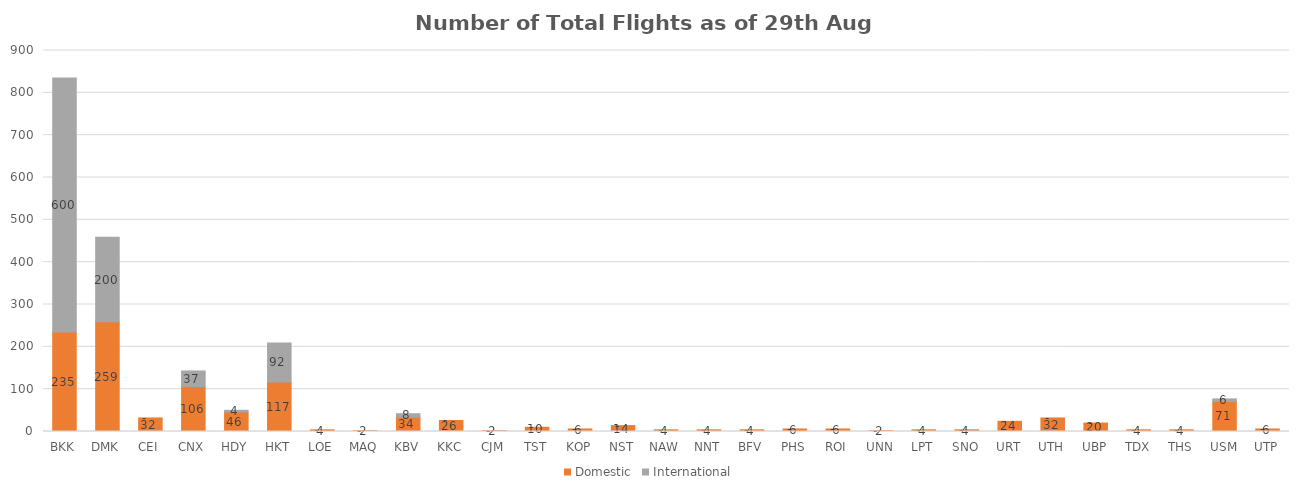
| Category | Domestic | International |
|---|---|---|
| BKK | 235 | 600 |
| DMK | 259 | 200 |
| CEI | 32 | 0 |
| CNX | 106 | 37 |
| HDY | 46 | 4 |
| HKT | 117 | 92 |
| LOE | 4 | 0 |
| MAQ | 2 | 0 |
| KBV | 34 | 8 |
| KKC | 26 | 0 |
| CJM | 2 | 0 |
| TST | 10 | 0 |
| KOP | 6 | 0 |
| NST | 14 | 0 |
| NAW | 4 | 0 |
| NNT | 4 | 0 |
| BFV | 4 | 0 |
| PHS | 6 | 0 |
| ROI | 6 | 0 |
| UNN | 2 | 0 |
| LPT | 4 | 0 |
| SNO | 4 | 0 |
| URT | 24 | 0 |
| UTH | 32 | 0 |
| UBP | 20 | 0 |
| TDX | 4 | 0 |
| THS | 4 | 0 |
| USM | 71 | 6 |
| UTP | 6 | 0 |